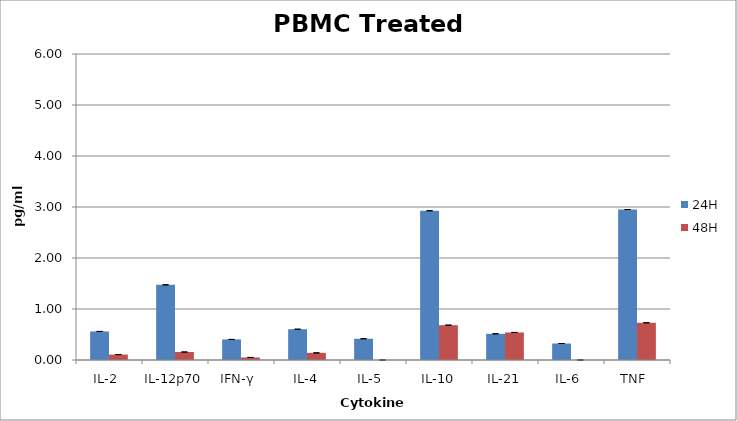
| Category | 24H | 48H |
|---|---|---|
| IL-2  | 0.56 | 0.107 |
| IL-12p70  | 1.473 | 0.157 |
| IFN-γ  | 0.403 | 0.05 |
| IL-4 | 0.603 | 0.14 |
| IL-5  | 0.417 | 0 |
| IL-10 | 2.927 | 0.683 |
| IL-21 | 0.513 | 0.54 |
| IL-6  | 0.323 | 0 |
| TNF  | 2.95 | 0.73 |